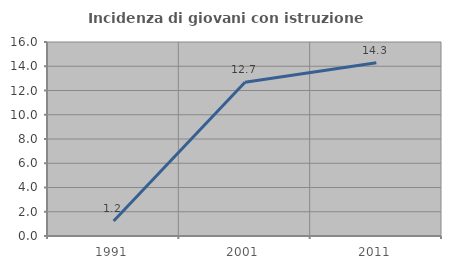
| Category | Incidenza di giovani con istruzione universitaria |
|---|---|
| 1991.0 | 1.235 |
| 2001.0 | 12.676 |
| 2011.0 | 14.286 |